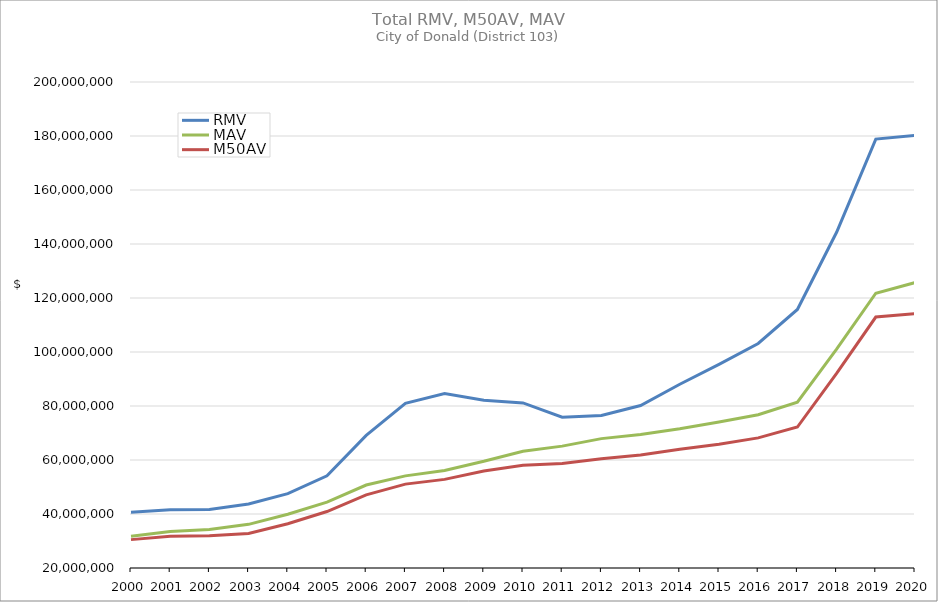
| Category | RMV | MAV | M50AV |
|---|---|---|---|
| 2000.0 | 40664018 | 31766912 | 30510207 |
| 2001.0 | 41551174 | 33520626 | 31736192 |
| 2002.0 | 41653931 | 34262438 | 31900078 |
| 2003.0 | 43679988 | 36163896 | 32814678 |
| 2004.0 | 47545669 | 39909293 | 36412528 |
| 2005.0 | 54133379 | 44412686 | 40914870 |
| 2006.0 | 69102529 | 50737606 | 47101204 |
| 2007.0 | 80976596 | 54117900 | 51066358 |
| 2008.0 | 84630151 | 56125867 | 52827532 |
| 2009.0 | 82108423 | 59521178 | 55947994 |
| 2010.0 | 81143324 | 63264252 | 58011595 |
| 2011.0 | 75877348 | 65135132 | 58735336 |
| 2012.0 | 76519039 | 67919673 | 60471319 |
| 2013.0 | 80185301 | 69468758 | 61831298 |
| 2014.0 | 88069594 | 71556614 | 63964957 |
| 2015.0 | 95446009 | 74046766 | 65867593 |
| 2016.0 | 103163994 | 76766698 | 68198636 |
| 2017.0 | 115747184 | 81440295 | 72205677 |
| 2018.0 | 144343781 | 101034460 | 92082013 |
| 2019.0 | 178867075 | 121762712 | 112950850 |
| 2020.0 | 180176676 | 125722859 | 114220842 |